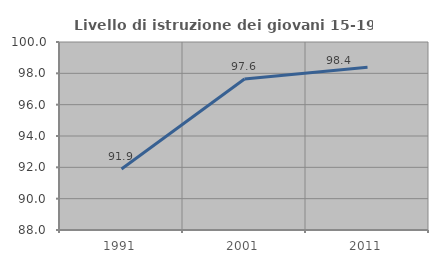
| Category | Livello di istruzione dei giovani 15-19 anni |
|---|---|
| 1991.0 | 91.897 |
| 2001.0 | 97.639 |
| 2011.0 | 98.385 |